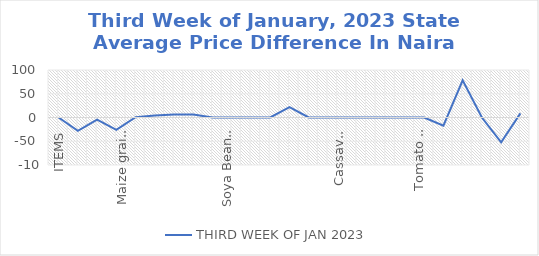
| Category | THIRD WEEK OF JAN 2023 |
|---|---|
| ITEMS | 0 |
| Rice, Imported, High Quality Sold loose  (1 mudu) | -28.261 |
| Rice, Agric Sold Loose(Low quality) imported  (1 mudu) | -4.348 |
| Rice Local, Sold Loose   (1 mudu) | -26.087 |
| Maize grain, white sold loose   (1 mudu) | 0.652 |
| Maize grain, yellow sold loose   (1 mudu) | 4.348 |
| Sorghum (Guinea Corn) white or brown, sold loose   (1 mudu) | 6.522 |
| millet (jero or maiwa) sold loose   (1 mudu) | 6.522 |
| Beans: white black eye. Sold loose   (1 mudu) | 0 |
| Beans Brown, sold loose  (1 mudu) | 0 |
| Soya Beans, sold loose    (1 mudu) | 0 |
| Gari White, sold loose  (1 mudu) | 0 |
| Gari Yellow, sold loose   (1 mudu) | 21.739 |
| Palm oil (1 schnap bottle) | 0 |
| Yam tuber (1 Medium Size) | 0 |
| Cassava tuber | 0 |
| Irish potato  (4 Litre rubber) | 0 |
| Sweet potato  (5 Medium Size) | 0 |
| Local live chicken  | 0 |
| Groundnut - shelled (fresh) | 0 |
| Tomato fresh   (4 Litre rubber) | -17.391 |
| Okro fresh     (1 mudu) | 78.261 |
| Okro dried    (1 mudu) | 0 |
| Onion   (4 Litre rubber) | -52.174 |
| Pepper fresh   (4 Litre rubber) | 8.696 |